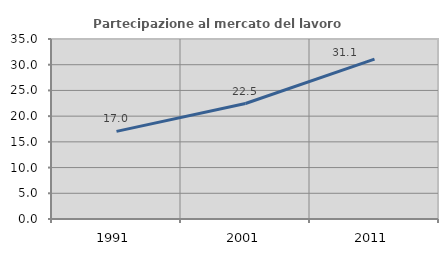
| Category | Partecipazione al mercato del lavoro  femminile |
|---|---|
| 1991.0 | 17.044 |
| 2001.0 | 22.458 |
| 2011.0 | 31.095 |